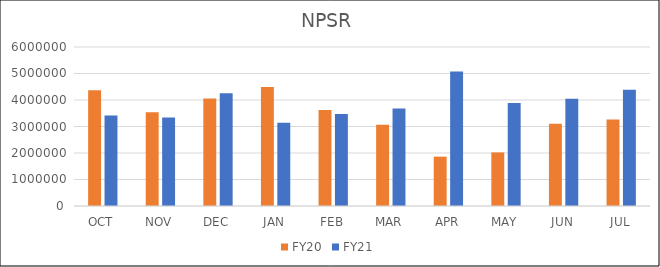
| Category | FY20 | FY21 |
|---|---|---|
| OCT | 4367152.91 | 3416681.98 |
| NOV | 3533126.76 | 3335168.05 |
| DEC | 4053444.22 | 4254259.31 |
| JAN | 4494660.63 | 3140057.4 |
| FEB | 3620447.2 | 3473175.01 |
| MAR | 3062817.39 | 3682802.21 |
| APR | 1861999.81 | 5071898.67 |
| MAY | 2022380.4 | 3888964.96 |
| JUN | 3108014.51 | 4045944.98 |
| JUL | 3267335.36 | 4387087.78 |